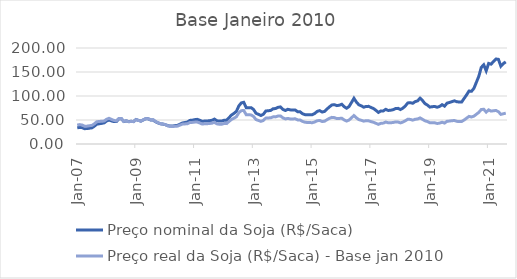
| Category | Preço nominal da Soja (R$/Saca) | Preço real da Soja (R$/Saca) - Base jan 2010 |
|---|---|---|
| 2007-01-01 | 33.676 | 39.298 |
| 2007-02-01 | 34.71 | 40.411 |
| 2007-03-01 | 34.005 | 39.504 |
| 2007-04-01 | 31.955 | 37.072 |
| 2007-05-01 | 32.124 | 37.21 |
| 2007-06-01 | 32.944 | 38.061 |
| 2007-07-01 | 33.651 | 38.733 |
| 2007-08-01 | 37.106 | 42.123 |
| 2007-09-01 | 41.301 | 46.345 |
| 2007-10-01 | 42.199 | 47.001 |
| 2007-11-01 | 42.959 | 47.351 |
| 2007-12-01 | 44.03 | 47.826 |
| 2008-01-01 | 47.928 | 51.551 |
| 2008-02-01 | 49.993 | 53.57 |
| 2008-03-01 | 48.061 | 51.141 |
| 2008-04-01 | 46.722 | 49.167 |
| 2008-05-01 | 46.654 | 48.192 |
| 2008-06-01 | 52.353 | 53.074 |
| 2008-07-01 | 52.961 | 53.096 |
| 2008-08-01 | 46.838 | 47.137 |
| 2008-09-01 | 48.141 | 48.273 |
| 2008-10-01 | 46.654 | 46.276 |
| 2008-11-01 | 47.32 | 46.905 |
| 2008-12-01 | 46.731 | 46.528 |
| 2009-01-01 | 51.018 | 50.789 |
| 2009-02-01 | 49.236 | 49.076 |
| 2009-03-01 | 47.665 | 47.912 |
| 2009-04-01 | 50.16 | 50.398 |
| 2009-05-01 | 52.781 | 52.938 |
| 2009-06-01 | 52.368 | 52.69 |
| 2009-07-01 | 49.935 | 50.567 |
| 2009-08-01 | 50.058 | 50.645 |
| 2009-09-01 | 46.267 | 46.695 |
| 2009-10-01 | 43.962 | 44.386 |
| 2009-11-01 | 42.012 | 42.388 |
| 2009-12-01 | 41.384 | 41.801 |
| 2010-01-01 | 40.216 | 40.216 |
| 2010-02-01 | 38.241 | 37.827 |
| 2010-03-01 | 37.384 | 36.747 |
| 2010-04-01 | 37.433 | 36.533 |
| 2010-05-01 | 38.397 | 36.895 |
| 2010-06-01 | 38.907 | 37.258 |
| 2010-07-01 | 41.365 | 39.526 |
| 2010-08-01 | 43.835 | 41.43 |
| 2010-09-01 | 44.747 | 41.834 |
| 2010-10-01 | 45.721 | 42.309 |
| 2010-11-01 | 49.172 | 44.794 |
| 2010-12-01 | 49.591 | 45.005 |
| 2011-01-01 | 50.779 | 45.637 |
| 2011-02-01 | 51.39 | 45.749 |
| 2011-03-01 | 49.544 | 43.838 |
| 2011-04-01 | 47.186 | 41.546 |
| 2011-05-01 | 47.83 | 42.11 |
| 2011-06-01 | 47.878 | 42.208 |
| 2011-07-01 | 48.502 | 42.779 |
| 2011-08-01 | 49.383 | 43.291 |
| 2011-09-01 | 51.937 | 45.19 |
| 2011-10-01 | 48.468 | 42.005 |
| 2011-11-01 | 47.736 | 41.194 |
| 2011-12-01 | 47.699 | 41.228 |
| 2012-01-01 | 49.552 | 42.702 |
| 2012-02-01 | 49.324 | 42.475 |
| 2012-03-01 | 54.927 | 47.039 |
| 2012-04-01 | 60.344 | 51.159 |
| 2012-05-01 | 63.788 | 53.589 |
| 2012-06-01 | 68.048 | 56.777 |
| 2012-07-01 | 79.356 | 65.223 |
| 2012-08-01 | 85.574 | 69.437 |
| 2012-09-01 | 86.824 | 69.836 |
| 2012-10-01 | 75.73 | 61.105 |
| 2012-11-01 | 75.73 | 60.953 |
| 2012-12-01 | 75.73 | 60.554 |
| 2013-01-01 | 71.992 | 57.389 |
| 2013-02-01 | 64.008 | 50.923 |
| 2013-03-01 | 61.838 | 49.047 |
| 2013-04-01 | 59.449 | 47.179 |
| 2013-05-01 | 61.888 | 48.957 |
| 2013-06-01 | 68.723 | 53.953 |
| 2013-07-01 | 69.319 | 54.344 |
| 2013-08-01 | 69.884 | 54.535 |
| 2013-09-01 | 73.469 | 56.565 |
| 2013-10-01 | 73.839 | 56.496 |
| 2013-11-01 | 76.35 | 58.255 |
| 2013-12-01 | 77.25 | 58.539 |
| 2014-01-01 | 72.059 | 54.386 |
| 2014-02-01 | 69.859 | 52.284 |
| 2014-03-01 | 72.27 | 53.297 |
| 2014-04-01 | 71.111 | 52.207 |
| 2014-05-01 | 70.742 | 52.173 |
| 2014-06-01 | 70.858 | 52.592 |
| 2014-07-01 | 67.297 | 50.225 |
| 2014-08-01 | 67.106 | 50.051 |
| 2014-09-01 | 63.063 | 47.027 |
| 2014-10-01 | 61.17 | 45.346 |
| 2014-11-01 | 61.17 | 44.835 |
| 2014-12-01 | 61.17 | 44.664 |
| 2015-01-01 | 61.143 | 44.348 |
| 2015-02-01 | 63.718 | 45.969 |
| 2015-03-01 | 67.9 | 48.4 |
| 2015-04-01 | 69.526 | 49.109 |
| 2015-05-01 | 66.608 | 46.859 |
| 2015-06-01 | 67.876 | 47.427 |
| 2015-07-01 | 72.893 | 50.637 |
| 2015-08-01 | 77.329 | 53.504 |
| 2015-09-01 | 81.345 | 55.493 |
| 2015-10-01 | 81.978 | 54.958 |
| 2015-11-01 | 79.973 | 52.981 |
| 2015-12-01 | 80.758 | 53.266 |
| 2016-01-01 | 82.746 | 53.754 |
| 2016-02-01 | 77.829 | 50.164 |
| 2016-03-01 | 74.528 | 47.829 |
| 2016-04-01 | 78.043 | 49.903 |
| 2016-05-01 | 86.425 | 54.645 |
| 2016-06-01 | 95.188 | 59.218 |
| 2016-07-01 | 87.464 | 54.625 |
| 2016-08-01 | 81.692 | 50.799 |
| 2016-09-01 | 79.5 | 49.42 |
| 2016-10-01 | 76.703 | 47.619 |
| 2016-11-01 | 78.273 | 48.567 |
| 2016-12-01 | 78.429 | 48.263 |
| 2017-01-01 | 76.034 | 46.588 |
| 2017-02-01 | 73.862 | 45.229 |
| 2017-03-01 | 70.006 | 43.03 |
| 2017-04-01 | 65.82 | 40.966 |
| 2017-05-01 | 68.937 | 43.127 |
| 2017-06-01 | 68.951 | 43.554 |
| 2017-07-01 | 72.241 | 45.768 |
| 2017-08-01 | 69.827 | 44.17 |
| 2017-09-01 | 70.411 | 44.228 |
| 2017-10-01 | 71.47 | 44.85 |
| 2017-11-01 | 73.874 | 45.99 |
| 2017-12-01 | 74.237 | 45.684 |
| 2018-01-01 | 71.83 | 44.012 |
| 2018-02-01 | 74.719 | 45.753 |
| 2018-03-01 | 79.395 | 48.434 |
| 2018-04-01 | 85.532 | 51.7 |
| 2018-05-01 | 86.123 | 51.217 |
| 2018-06-01 | 84.828 | 49.712 |
| 2018-07-01 | 88.294 | 51.514 |
| 2018-08-01 | 89.91 | 52.105 |
| 2018-09-01 | 95.483 | 54.362 |
| 2018-10-01 | 90.535 | 51.409 |
| 2018-11-01 | 84.156 | 48.339 |
| 2018-12-01 | 81.102 | 46.796 |
| 2019-01-01 | 76.891 | 44.336 |
| 2019-02-01 | 77.749 | 44.276 |
| 2019-03-01 | 78.286 | 44.109 |
| 2019-04-01 | 76.563 | 42.752 |
| 2019-05-01 | 78.361 | 43.581 |
| 2019-06-01 | 81.898 | 45.263 |
| 2019-07-01 | 78.817 | 43.564 |
| 2019-08-01 | 85.084 | 47.267 |
| 2019-09-01 | 86.5 | 47.813 |
| 2019-10-01 | 88.251 | 48.514 |
| 2019-11-01 | 89.875 | 48.99 |
| 2019-12-01 | 88.152 | 47.229 |
| 2020-01-01 | 87.391 | 46.778 |
| 2020-02-01 | 87.609 | 46.889 |
| 2020-03-01 | 94.969 | 50.005 |
| 2020-04-01 | 102.298 | 53.837 |
| 2020-05-01 | 110.408 | 57.49 |
| 2020-06-01 | 109.763 | 56.253 |
| 2020-07-01 | 116.054 | 58.118 |
| 2020-08-01 | 128.592 | 61.996 |
| 2020-09-01 | 141.199 | 65.899 |
| 2020-10-01 | 159.635 | 71.858 |
| 2020-11-01 | 164.992 | 72.364 |
| 2020-12-01 | 152.562 | 66.409 |
| 2021-01-01 | 167.865 | 71.004 |
| 2021-02-01 | 166.383 | 68.524 |
| 2021-03-01 | 171.867 | 69.278 |
| 2021-04-01 | 177.098 | 69.837 |
| 2021-05-01 | 176.394 | 67.274 |
| 2021-06-01 | 162.076 | 61.744 |
| 2021-07-01 | 167.597 | 62.938 |
| 2021-08-01 | 171.058 | 64.326 |